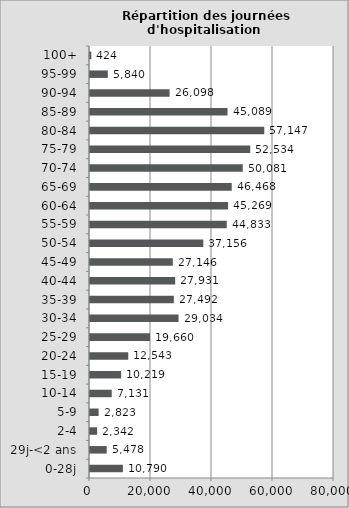
| Category | Series 0 |
|---|---|
| 0-28j | 10790 |
| 29j-<2 ans | 5478 |
|   2-4 | 2342 |
|   5-9 | 2823 |
|  10-14 | 7131 |
|  15-19 | 10219 |
|  20-24 | 12543 |
|  25-29 | 19660 |
|  30-34 | 29034 |
|  35-39 | 27492 |
|  40-44 | 27931 |
|  45-49 | 27146 |
|  50-54 | 37156 |
|  55-59 | 44833 |
|  60-64 | 45269 |
|  65-69 | 46468 |
|  70-74 | 50081 |
|  75-79 | 52534 |
|  80-84 | 57147 |
|  85-89 | 45089 |
|  90-94 | 26098 |
|  95-99 | 5840 |
| 100+ | 424 |